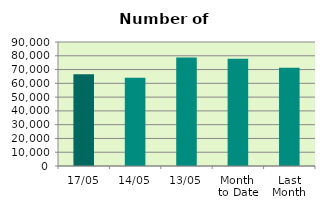
| Category | Series 0 |
|---|---|
| 17/05 | 66666 |
| 14/05 | 64068 |
| 13/05 | 78696 |
| Month 
to Date | 77904 |
| Last
Month | 71251.4 |